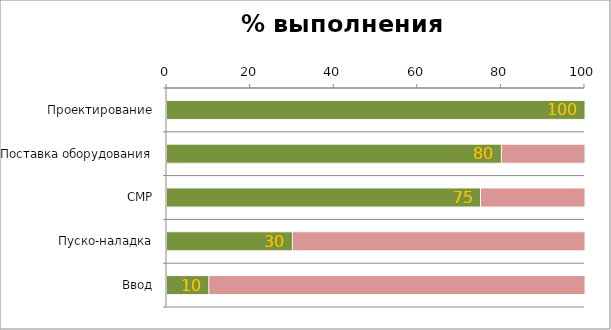
| Category | Служебный | Выполнено, % |
|---|---|---|
| Проектирование | 100 | 100 |
| Поставка оборудования | 100 | 80 |
| СМР | 100 | 75 |
| Пуско-наладка | 100 | 30 |
| Ввод | 100 | 10 |